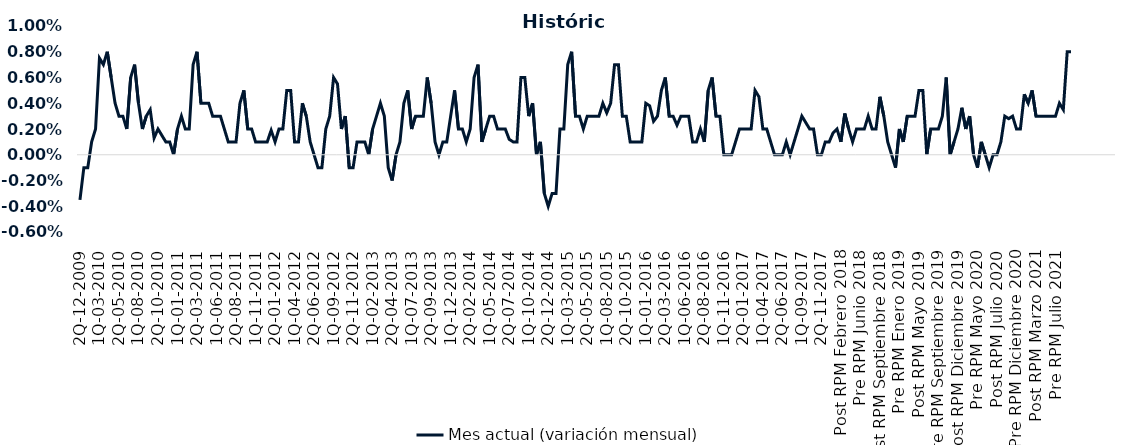
| Category | Mes actual (variación mensual)  |
|---|---|
| 2Q-12-2009 | -0.004 |
| 1Q-01-2010 | -0.001 |
| 2Q-01-2010 | -0.001 |
| 1Q-02-2010 | 0.001 |
| 2Q-02-2010 | 0.002 |
| 1Q-03-2010 | 0.008 |
| 2Q-03-2010 | 0.007 |
| 1Q-04-2010 | 0.008 |
| 2Q-04-2010 | 0.006 |
| 1Q-05-2010 | 0.004 |
| 2Q-05-2010 | 0.003 |
| 1Q-06-2010 | 0.003 |
| 2Q-06-2010 | 0.002 |
| 1Q-07-2010 | 0.006 |
| 2Q-07-2010 | 0.007 |
| 1Q-08-2010 | 0.004 |
| 2Q-08-2010 | 0.002 |
| 1Q-09-2010 | 0.003 |
| 2Q-09-2010 | 0.004 |
| 1Q-10-2010 | 0.001 |
| 2Q-10-2010 | 0.002 |
| 1Q-11-2010 | 0.002 |
| 2Q-11-2010 | 0.001 |
| 1Q-12-2010 | 0.001 |
| 2Q-12-2010 | 0 |
| 1Q-01-2011 | 0.002 |
| 2Q-01-2011 | 0.003 |
| 1Q-02-2011 | 0.002 |
| 2Q-02-2011 | 0.002 |
| 1Q-03-2011 | 0.007 |
| 2Q-03-2011 | 0.008 |
| 1Q-04-2011 | 0.004 |
| 2Q-04-2011 | 0.004 |
| 1Q-05-2011 | 0.004 |
| 2Q-05-2011 | 0.003 |
| 1Q-06-2011 | 0.003 |
| 2Q-06-2011 | 0.003 |
| 1Q-07-2011 | 0.002 |
| 2Q-07-2011 | 0.001 |
| 1Q-08-2011 | 0.001 |
| 2Q-08-2011 | 0.001 |
| 1Q-09-2011 | 0.004 |
| 2Q-09-2011 | 0.005 |
| 1Q-10-2011 | 0.002 |
| 2Q-10-2012 | 0.002 |
| 1Q-11-2011 | 0.001 |
| 2Q-11-2011 | 0.001 |
| 1Q-12-2011 | 0.001 |
| 2Q-12-2011 | 0.001 |
| 1Q-01-2012 | 0.002 |
| 2Q-01-2012 | 0.001 |
| 1Q-02-2012 | 0.002 |
| 2Q-02-2012 | 0.002 |
| 1Q-03-2012 | 0.005 |
| 2Q-03-2012 | 0.005 |
| 1Q-04-2012 | 0.001 |
| 2Q-04-2012 | 0.001 |
| 1Q-05-2012 | 0.004 |
| 2Q-05-2012 | 0.003 |
| 1Q-06-2012 | 0.001 |
| 2Q-06-2012 | 0 |
| 1Q-07-2012 | -0.001 |
| 2Q-07-2012 | -0.001 |
| 1Q-08-2012 | 0.002 |
| 2Q-08-2012 | 0.003 |
| 1Q-09-2012 | 0.006 |
| 2Q-09-2012 | 0.006 |
| 1Q-10-2012 | 0.002 |
| 2Q-10-2012 | 0.003 |
| 1Q-11-2012 | -0.001 |
| 2Q-11-2012 | -0.001 |
| 1Q-12-2012 | 0.001 |
| 2Q-12-2012 | 0.001 |
| 1Q-01-2013 | 0.001 |
| 2Q-01-2013 | 0 |
| 1Q-02-2013 | 0.002 |
| 2Q-02-2013 | 0.003 |
| 1Q-03-2013 | 0.004 |
| 2Q-03-2013 | 0.003 |
| 1Q-04-2013 | -0.001 |
| 2Q-04-2013 | -0.002 |
| 1Q-05-2013 | 0 |
| 2Q-05-2013 | 0.001 |
| 1Q-06-2013 | 0.004 |
| 2Q-06-2013 | 0.005 |
| 1Q-07-2013 | 0.002 |
| 2Q-07-2013 | 0.003 |
| 1Q-08-2013 | 0.003 |
| 2Q-08-2013 | 0.003 |
| 1Q-09-2013 | 0.006 |
| 2Q-09-2013 | 0.004 |
| 1Q-10-2013 | 0.001 |
| 2Q-10-2013 | 0 |
| 1Q-11-2013 | 0.001 |
| 2Q-11-2013 | 0.001 |
| 1Q-12-2013 | 0.003 |
| 2Q-12-2013 | 0.005 |
| 1Q-01-2014 | 0.002 |
| 2Q-01-2014 | 0.002 |
| 1Q-02-2014 | 0.001 |
| 2Q-02-2014 | 0.002 |
| 1Q-03-2014 | 0.006 |
| 2Q-03-2014 | 0.007 |
| 1Q-04-2014 | 0.001 |
| 2Q-04-2014 | 0.002 |
| 1Q-05-2014 | 0.003 |
| 2Q-05-2014 | 0.003 |
| 1Q-06-2014 | 0.002 |
| 2Q-06-2014 | 0.002 |
| 1Q-07-2014 | 0.002 |
| 2Q-07-2014 | 0.001 |
| 1Q-08-2014 | 0.001 |
| 2Q-08-2014 | 0.001 |
| 1Q-09-2014 | 0.006 |
| 2Q-09-2014 | 0.006 |
| 1Q-10-2014 | 0.003 |
| 2Q-10-2014 | 0.004 |
| 1Q-11-2014 | 0 |
| 2Q-11-2014 | 0.001 |
| 1Q-12-2014 | -0.003 |
| 2Q-12-2014 | -0.004 |
| 1Q-01-2015 | -0.003 |
| 2Q-01-2015 | -0.003 |
| 1Q-02-2015 | 0.002 |
| 2Q-02-2015 | 0.002 |
| 1Q-03-2015 | 0.007 |
| 2Q-03-2015 | 0.008 |
| 1Q-04-2015 | 0.003 |
| 2Q-04-2015 | 0.003 |
| 1Q-05-2015 | 0.002 |
| 2Q-05-2015 | 0.003 |
| 1Q-06-2015 | 0.003 |
| 2Q-06-2015 | 0.003 |
| 1Q-07-2015 | 0.003 |
| 2Q-07-2015 | 0.004 |
| 1Q-08-2015 | 0.003 |
| 2Q-08-2015 | 0.004 |
| 1Q-09-2015 | 0.007 |
| 2Q-09-2015 | 0.007 |
| 1Q-10-2015 | 0.003 |
| 2Q-10-2015 | 0.003 |
| 1Q-11-2015 | 0.001 |
| 2Q-11-2015 | 0.001 |
| 1Q-12-2015 | 0.001 |
| 2Q-12-2015 | 0.001 |
| 1Q-01-2016 | 0.004 |
| 2Q-01-2016 | 0.004 |
| 1Q-02-2016 | 0.003 |
| 2Q-02-2016 | 0.003 |
| 1Q-03-2016 | 0.005 |
| 2Q-03-2016 | 0.006 |
| 1Q-04-2016 | 0.003 |
| 2Q-04-2016 | 0.003 |
| 1Q-05-2016 | 0.002 |
| 2Q-05-2016 | 0.003 |
| 1Q-06-2016 | 0.003 |
| 2Q-06-2016 | 0.003 |
| 1Q-07-2016 | 0.001 |
| 2Q-07-2016 | 0.001 |
| 1Q-08-2016 | 0.002 |
| 2Q-08-2016 | 0.001 |
| 1Q-09-2016 | 0.005 |
| 2Q-09-2016 | 0.006 |
| 1Q-10-2016 | 0.003 |
| 2Q-10-2016 | 0.003 |
| 1Q-11-2016 | 0 |
| 2Q-11-2016 | 0 |
| 1Q-12-2016 | 0 |
| 2Q-12-2016 | 0.001 |
| 1Q-01-2017 | 0.002 |
| 2Q-01-2017 | 0.002 |
| 1Q-02-2017 | 0.002 |
| 2Q-02-2017 | 0.002 |
| 1Q-03-2017 | 0.005 |
| 2Q-03-2017 | 0.004 |
| 1Q-04-2017 | 0.002 |
| 2Q-04-2017 | 0.002 |
| 1Q-05-2017 | 0.001 |
| 2Q-05-2017 | 0 |
| 1Q-06-2017 | 0 |
| 2Q-06-2017 | 0 |
| 1Q-07-2017 | 0.001 |
| 2Q-07-2017 | 0 |
| 1Q-08-2017 | 0.001 |
| 2Q-08-2017 | 0.002 |
| 1Q-09-2017 | 0.003 |
| 2Q-09-2017 | 0.002 |
| 1Q-10-2017 | 0.002 |
| 2Q-10-2017 | 0.002 |
| 1Q-11-2017 | 0 |
| 2Q-11-2017 | 0 |
| 1Q-12-2017 | 0.001 |
| 2Q-12-2017 | 0.001 |
| 1Q-01-2018 | 0.002 |
| 2Q-01-2018 | 0.002 |
| Post RPM Febrero 2018 | 0.001 |
| Pre RPM Marzo 2018 | 0.003 |
| Post RPM Marzo 2018 | 0.002 |
| Pre RPM Mayo 2018 | 0.001 |
| Post RPM Mayo 2018 | 0.002 |
| Pre RPM Junio 2018 | 0.002 |
| Post RPM Junio 2018 | 0.002 |
| Pre RPM Julio 2018 | 0.003 |
| Post RPM Julio 2018 | 0.002 |
| Pre RPM Septiembre 2018 | 0.002 |
| Post RPM Septiembre 2018 | 0.004 |
| Pre RPM Octubre 2018 | 0.003 |
| Post RPM Octubre 2018 | 0.001 |
| Pre RPM Diciembre 2018 | 0 |
| Post RPM Diciembre 2018 | -0.001 |
| Pre RPM Enero 2019 | 0.002 |
| Post RPM Enero 2019 | 0.001 |
| Pre RPM Marzo 2019 | 0.003 |
| Post RPM Marzo 2019 | 0.003 |
| Pre RPM Mayo 2019 | 0.003 |
| Post RPM Mayo 2019 | 0.005 |
| Pre RPM Junio 2019 | 0.005 |
| Post RPM Junio 2019 | 0 |
| Pre RPM Julio 2019 | 0.002 |
| Post RPM Julio 2019 | 0.002 |
| Pre RPM Septiembre 2019 | 0.002 |
| Post RPM Septiembre 2019 | 0.003 |
| Pre RPM Octubre 2019 | 0.006 |
| Post RPM Octubre 2019 | 0 |
| Pre RPM Diciembre 2019 | 0.001 |
| Post RPM Diciembre 2019 | 0.002 |
| Pre RPM Enero 2020 | 0.004 |
| Post RPM Enero 2020 | 0.002 |
| Pre RPM Marzo 2020 | 0.003 |
| Post RPM Marzo 2020 | 0 |
| Pre RPM Mayo 2020 | -0.001 |
| Post RPM Mayo 2020 | 0.001 |
| Pre RPM Junio 2020 | 0 |
| Post RPM Junio 2020 | -0.001 |
| Pre RPM Julio 2020 | 0 |
| Post RPM Julio 2020 | 0 |
| Pre RPM Septiembre 2020 | 0.001 |
| Post RPM Septiembre 2020 | 0.003 |
| Pre RPM Octubre 2020 | 0.003 |
| Post RPM Octubre 2020 | 0.003 |
| Pre RPM Diciembre 2020 | 0.002 |
| Post RPM Diciembre 2020 | 0.002 |
| Pre RPM Enero 2021 | 0.005 |
| Post RPM Enero 2021 | 0.004 |
| Pre RPM Marzo 2021 | 0.005 |
| Post RPM Marzo 2021 | 0.003 |
| Pre RPM Mayo 2021 | 0.003 |
| Post RPM Mayo 2021 | 0.003 |
| Pre RPM Junio 2021 | 0.003 |
| Post RPM Junio 2021 | 0.003 |
| Pre RPM Julio 2021 | 0.003 |
| Post RPM Julio 2021 | 0.004 |
| Pre RPM Agosto 2021 | 0.004 |
| Post RPM Agosto 2021 | 0.008 |
| Pre RPM Octubre 2021 | 0.008 |